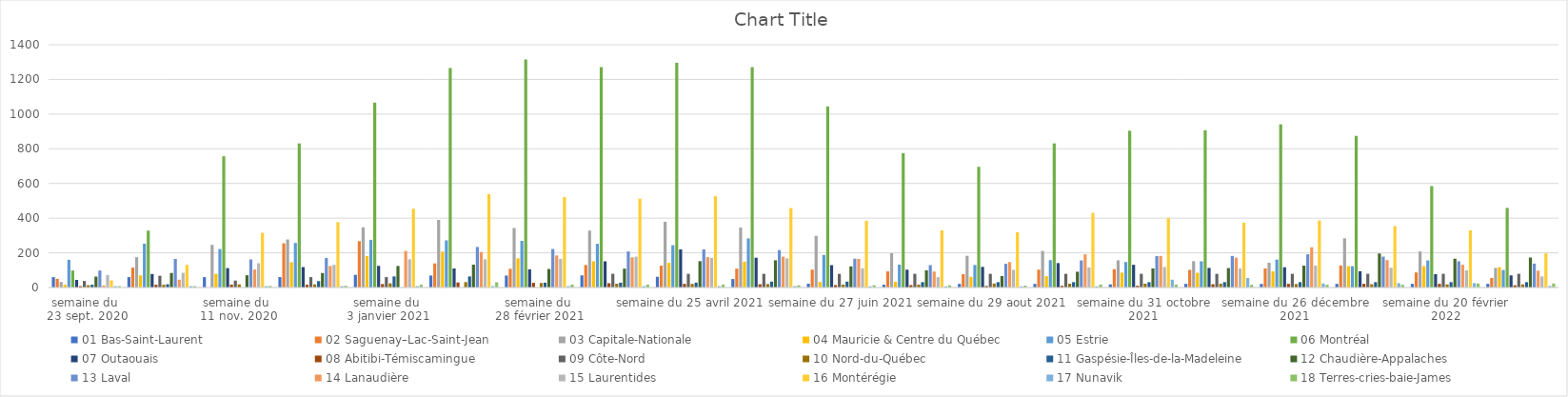
| Category | 01 Bas-Saint-Laurent | 02 Saguenay–Lac-Saint-Jean | 03 Capitale-Nationale | 04 Mauricie & Centre du Québec | 05 Estrie | 06 Montréal | 07 Outaouais | 08 Abitibi-Témiscamingue | 09 Côte-Nord | 10 Nord-du-Québec | 11 Gaspésie-Îles-de-la-Madeleine | 12 Chaudière-Appalaches | 13 Laval | 14 Lanaudière | 15 Laurentides | 16 Montérégie | 17 Nunavik | 18 Terres-cries-baie-James |
|---|---|---|---|---|---|---|---|---|---|---|---|---|---|---|---|---|---|---|
| semaine du 
23 sept. 2020 | 60 | 50 | 32 | 16 | 160 | 98 | 44 | 8 | 38 | 13 | 16 | 63 | 98 | 12 | 72 | 41 | 8 | 8 |
| semaine du 
20 oct. 2020 | 60 | 115 | 175 | 70 | 253 | 328 | 78 | 16 | 68 | 16 | 19 | 84 | 165 | 45 | 85 | 130 | 8 | 8 |
| semaine du 
11 nov. 2020 | 60 | 0 | 246 | 79 | 222 | 757 | 112 | 17 | 40 | 18 | 0 | 70.6 | 162 | 104 | 140 | 315 | 8 | 9 |
| semaine du 
29 nov. 2020 | 60 | 255 | 277 | 146 | 257 | 831 | 118 | 16 | 60 | 18 | 37 | 83.6 | 170 | 124 | 131 | 377 | 8 | 10 |
| semaine du 
3 janvier 2021 | 73 | 267 | 347 | 181 | 275 | 1066 | 125 | 20 | 60 | 24.2 | 64 | 124 | 0 | 211 | 163 | 454 | 8 | 16 |
| semaine du 
31 janvier 2021 | 69 | 139 | 390 | 207 | 272 | 1266 | 110 | 29 | 0 | 31.2 | 64 | 132 | 234 | 205 | 163 | 539 | 8 | 30 |
| semaine du 
28 février 2021 | 69 | 108 | 343 | 168 | 269 | 1315 | 105 | 27 | 0 | 26.2 | 28 | 107 | 222 | 185 | 165 | 522 | 8 | 17 |
| semaine du 
4 avril 2021 | 70 | 130 | 328 | 151 | 252 | 1271 | 151 | 25 | 79 | 22 | 28 | 109 | 208 | 174 | 178 | 512 | 8 | 17 |
| semaine du 25 avril 2021 | 62 | 126 | 379 | 142 | 244 | 1296 | 220 | 21 | 79 | 21 | 28 | 152 | 220 | 175 | 171 | 526 | 8 | 17 |
| semaine du 30 mai 2021 | 49 | 109 | 346 | 149 | 283 | 1271 | 172 | 19 | 79 | 20 | 34 | 157 | 216 | 178 | 168 | 458 | 8 | 13 |
| semaine du 27 juin 2021 | 22 | 103 | 298 | 32 | 188 | 1045 | 129 | 14 | 79 | 17 | 34 | 122 | 166 | 165 | 111 | 385 | 7 | 13 |
| semiane du 25 juillet 2021 | 16 | 93 | 198 | 33 | 132 | 775 | 103 | 14 | 79 | 17 | 31 | 99 | 129 | 92 | 60 | 330 | 7 | 13 |
| semaine du 29 aout 2021 | 21 | 77 | 183 | 62 | 130 | 696 | 119 | 9 | 79 | 23 | 31 | 66 | 137 | 147 | 102 | 319 | 7 | 11 |
| semaine du 26 septembre 2021 | 21 | 103 | 211 | 65 | 158 | 831 | 141 | 10 | 79 | 22 | 31 | 91 | 156 | 192 | 116 | 431 | 7 | 17 |
| semaine du 31 octobre 2021 | 18 | 106 | 157 | 86 | 147 | 904 | 131 | 10 | 79 | 22 | 31 | 110 | 181 | 182 | 118 | 400 | 45 | 17 |
| semaine du 28 novembre 2021 | 21 | 102 | 152 | 85 | 151 | 907 | 113 | 19 | 79 | 22 | 31 | 112 | 182 | 172 | 110 | 374 | 55 | 16 |
| semaine du 26 décembre 2021 | 21 | 110 | 143 | 93 | 161 | 941 | 117 | 21 | 79 | 20 | 31 | 126 | 192 | 232 | 126 | 387 | 23 | 16 |
| semaine du 30 janvier 2022 | 21 | 127 | 284 | 123 | 123 | 874 | 94 | 21 | 79 | 19 | 31 | 196 | 178 | 158 | 114 | 354 | 25 | 16 |
| semaine du 20 février 2022 | 21 | 87 | 208 | 123 | 156 | 585 | 77 | 21 | 79 | 18 | 31 | 166 | 151 | 131 | 99 | 330 | 25 | 23 |
| semaine du 20 mars 2022 | 21 | 55 | 113 | 117 | 101 | 459 | 70 | 13 | 79 | 18 | 31 | 173 | 138 | 97 | 64 | 197 | 9 | 23 |